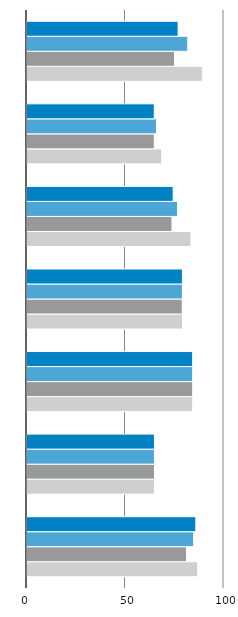
| Category | Summe von Maximum | Summe von Minimum | Summe von Deutschland | Summe von Anteil an den Beschäftigten insg. In % VZÄ |
|---|---|---|---|---|
| 7 | 86.6 | 81 | 84.6 | 85.7 |
| 6 | 64.7 | 64.7 | 64.7 | 64.7 |
| 5 | 84.1 | 84.1 | 84.1 | 84.1 |
| 4 | 79 | 78.8 | 78.9 | 78.9 |
| 3 | 83.2 | 73.6 | 76.4 | 74.2 |
| 2 | 68.4 | 64.6 | 65.7 | 64.6 |
| 1 | 89 | 74.9 | 81.6 | 76.7 |